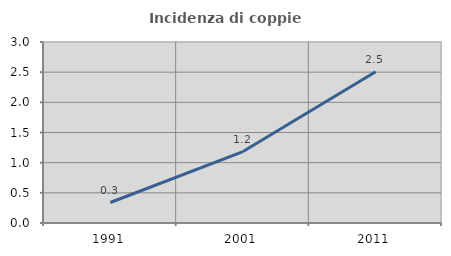
| Category | Incidenza di coppie miste |
|---|---|
| 1991.0 | 0.34 |
| 2001.0 | 1.184 |
| 2011.0 | 2.508 |